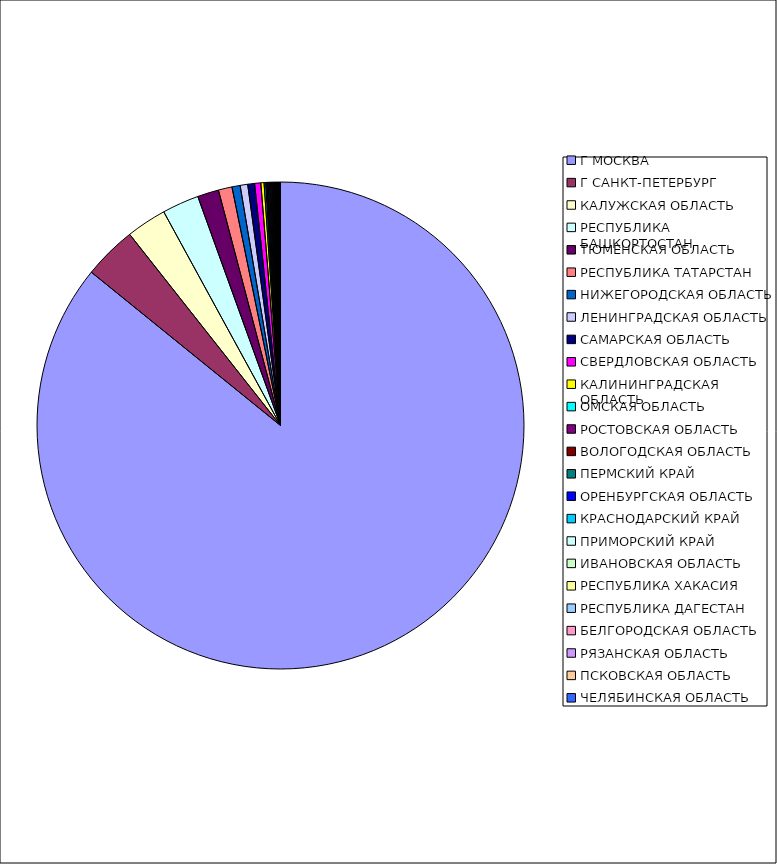
| Category | Оборот |
|---|---|
| Г МОСКВА | 0.858 |
| Г САНКТ-ПЕТЕРБУРГ | 0.035 |
| КАЛУЖСКАЯ ОБЛАСТЬ | 0.027 |
| РЕСПУБЛИКА БАШКОРТОСТАН | 0.024 |
| ТЮМЕНСКАЯ ОБЛАСТЬ | 0.014 |
| РЕСПУБЛИКА ТАТАРСТАН | 0.009 |
| НИЖЕГОРОДСКАЯ ОБЛАСТЬ | 0.005 |
| ЛЕНИНГРАДСКАЯ ОБЛАСТЬ | 0.005 |
| САМАРСКАЯ ОБЛАСТЬ | 0.005 |
| СВЕРДЛОВСКАЯ ОБЛАСТЬ | 0.004 |
| КАЛИНИНГРАДСКАЯ ОБЛАСТЬ | 0.002 |
| ОМСКАЯ ОБЛАСТЬ | 0.001 |
| РОСТОВСКАЯ ОБЛАСТЬ | 0.001 |
| ВОЛОГОДСКАЯ ОБЛАСТЬ | 0.001 |
| ПЕРМСКИЙ КРАЙ | 0.001 |
| ОРЕНБУРГСКАЯ ОБЛАСТЬ | 0.001 |
| КРАСНОДАРСКИЙ КРАЙ | 0.001 |
| ПРИМОРСКИЙ КРАЙ | 0 |
| ИВАНОВСКАЯ ОБЛАСТЬ | 0 |
| РЕСПУБЛИКА ХАКАСИЯ | 0 |
| РЕСПУБЛИКА ДАГЕСТАН | 0 |
| БЕЛГОРОДСКАЯ ОБЛАСТЬ | 0 |
| РЯЗАНСКАЯ ОБЛАСТЬ | 0 |
| ПСКОВСКАЯ ОБЛАСТЬ | 0 |
| ЧЕЛЯБИНСКАЯ ОБЛАСТЬ | 0 |
| СТАВРОПОЛЬСКИЙ КРАЙ | 0 |
| МОСКОВСКАЯ ОБЛАСТЬ | 0 |
| УДМУРТСКАЯ РЕСПУБЛИКА | 0 |
| САРАТОВСКАЯ ОБЛАСТЬ | 0 |
| РЕСПУБЛИКА МОРДОВИЯ | 0 |
| ИРКУТСКАЯ ОБЛАСТЬ | 0 |
| СМОЛЕНСКАЯ ОБЛАСТЬ | 0 |
| НОВОСИБИРСКАЯ ОБЛАСТЬ | 0 |
| ТВЕРСКАЯ ОБЛАСТЬ | 0 |
| АЛТАЙСКИЙ КРАЙ | 0 |
| КУРГАНСКАЯ ОБЛАСТЬ | 0 |
| ЛИПЕЦКАЯ ОБЛАСТЬ | 0 |
| КИРОВСКАЯ ОБЛАСТЬ | 0 |
| РЕСПУБЛИКА КОМИ | 0 |
| КЕМЕРОВСКАЯ ОБЛАСТЬ | 0 |
| ТУЛЬСКАЯ ОБЛАСТЬ | 0 |
| КАБАРДИНО-БАЛКАРСКАЯ РЕСПУБЛИКА | 0 |